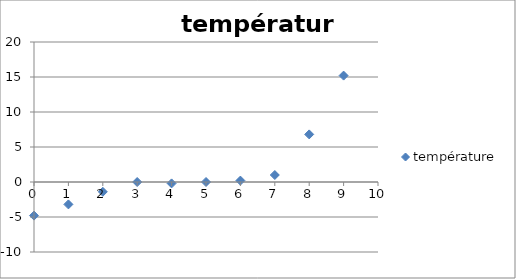
| Category | température |
|---|---|
| 0.0 | -4.8 |
| 1.0 | -3.2 |
| 2.0 | -1.4 |
| 3.0 | 0 |
| 4.0 | -0.2 |
| 5.0 | 0 |
| 6.0 | 0.2 |
| 7.0 | 1 |
| 8.0 | 6.8 |
| 9.0 | 15.2 |